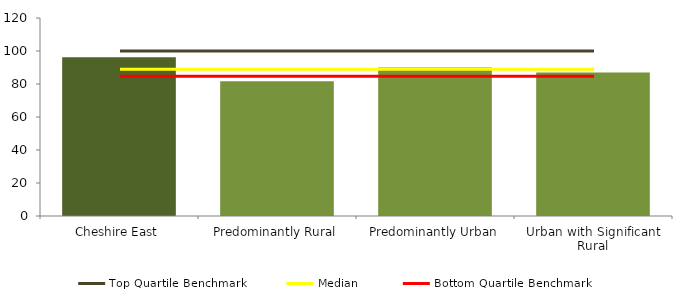
| Category | Series 0 |
|---|---|
| Cheshire East | 96.154 |
| Predominantly Rural | 81.661 |
| Predominantly Urban | 89.965 |
| Urban with Significant Rural | 86.996 |